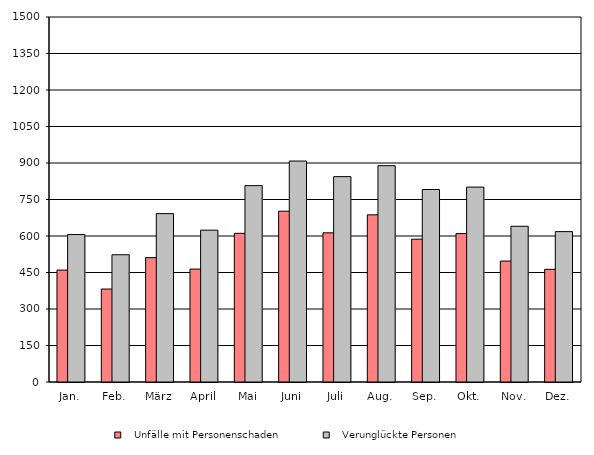
| Category |    Unfälle mit Personenschaden |    Verunglückte Personen |
|---|---|---|
| Jan. | 460 | 606 |
| Feb. | 382 | 523 |
| März | 511 | 692 |
| April | 464 | 624 |
| Mai | 611 | 807 |
| Juni | 702 | 908 |
| Juli | 613 | 844 |
| Aug. | 687 | 889 |
| Sep. | 587 | 791 |
| Okt. | 610 | 801 |
| Nov. | 497 | 640 |
| Dez. | 463 | 618 |